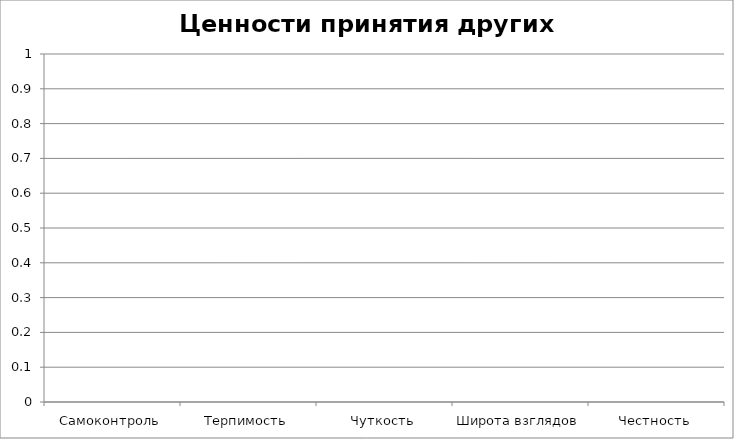
| Category | Ценности принятия других людей |
|---|---|
| Самоконтроль | 0 |
| Терпимость | 0 |
| Чуткость | 0 |
| Широта взглядов | 0 |
| Честность | 0 |